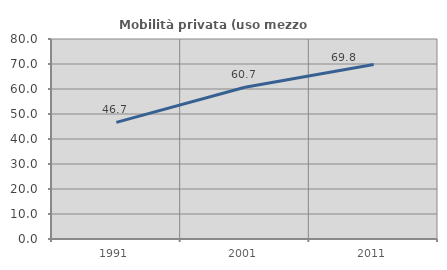
| Category | Mobilità privata (uso mezzo privato) |
|---|---|
| 1991.0 | 46.667 |
| 2001.0 | 60.714 |
| 2011.0 | 69.767 |